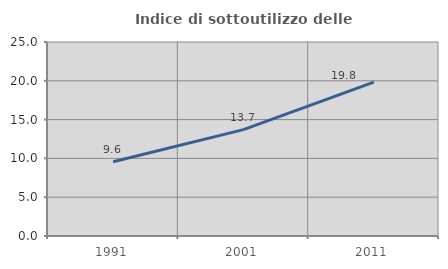
| Category | Indice di sottoutilizzo delle abitazioni  |
|---|---|
| 1991.0 | 9.559 |
| 2001.0 | 13.71 |
| 2011.0 | 19.82 |